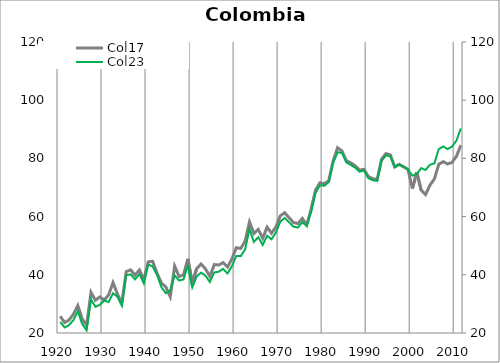
| Category | Col17 |
|---|---|
| 1920.0 | 25.761 |
| 1921.0 | 23.592 |
| 1922.0 | 24.442 |
| 1923.0 | 26.406 |
| 1924.0 | 29.457 |
| 1925.0 | 24.835 |
| 1926.0 | 22.595 |
| 1927.0 | 33.958 |
| 1928.0 | 31.242 |
| 1929.0 | 32.402 |
| 1930.0 | 31.372 |
| 1931.0 | 33.051 |
| 1932.0 | 37.328 |
| 1933.0 | 33.38 |
| 1934.0 | 30.25 |
| 1935.0 | 41.1 |
| 1936.0 | 41.691 |
| 1937.0 | 39.884 |
| 1938.0 | 41.666 |
| 1939.0 | 38.306 |
| 1940.0 | 44.465 |
| 1941.0 | 44.632 |
| 1942.0 | 40.556 |
| 1943.0 | 37.176 |
| 1944.0 | 35.819 |
| 1945.0 | 32.453 |
| 1946.0 | 42.976 |
| 1947.0 | 39.447 |
| 1948.0 | 39.945 |
| 1949.0 | 45.475 |
| 1950.0 | 37.28 |
| 1951.0 | 42.117 |
| 1952.0 | 43.709 |
| 1953.0 | 42.032 |
| 1954.0 | 39.444 |
| 1955.0 | 43.518 |
| 1956.0 | 43.382 |
| 1957.0 | 44.165 |
| 1958.0 | 42.651 |
| 1959.0 | 45.415 |
| 1960.0 | 49.305 |
| 1961.0 | 49.033 |
| 1962.0 | 51.57 |
| 1963.0 | 58.161 |
| 1964.0 | 54.2 |
| 1965.0 | 55.617 |
| 1966.0 | 52.586 |
| 1967.0 | 56.374 |
| 1968.0 | 54.286 |
| 1969.0 | 56.472 |
| 1970.0 | 60.271 |
| 1971.0 | 61.35 |
| 1972.0 | 59.577 |
| 1973.0 | 57.98 |
| 1974.0 | 57.609 |
| 1975.0 | 59.37 |
| 1976.0 | 57.14 |
| 1977.0 | 62.566 |
| 1978.0 | 69.13 |
| 1979.0 | 71.635 |
| 1980.0 | 71.272 |
| 1981.0 | 72.321 |
| 1982.0 | 79.122 |
| 1983.0 | 83.677 |
| 1984.0 | 82.55 |
| 1985.0 | 79.239 |
| 1986.0 | 78.503 |
| 1987.0 | 77.452 |
| 1988.0 | 75.98 |
| 1989.0 | 76.247 |
| 1990.0 | 73.789 |
| 1991.0 | 73.023 |
| 1992.0 | 72.725 |
| 1993.0 | 79.757 |
| 1994.0 | 81.671 |
| 1995.0 | 81.193 |
| 1996.0 | 77.1 |
| 1997.0 | 77.97 |
| 1998.0 | 77.11 |
| 1999.0 | 76.238 |
| 2000.0 | 69.607 |
| 2001.0 | 75.256 |
| 2002.0 | 69.075 |
| 2003.0 | 67.582 |
| 2004.0 | 70.822 |
| 2005.0 | 72.937 |
| 2006.0 | 77.989 |
| 2007.0 | 78.871 |
| 2008.0 | 78.084 |
| 2009.0 | 78.606 |
| 2010.0 | 80.7 |
| 2011.0 | 84.523 |